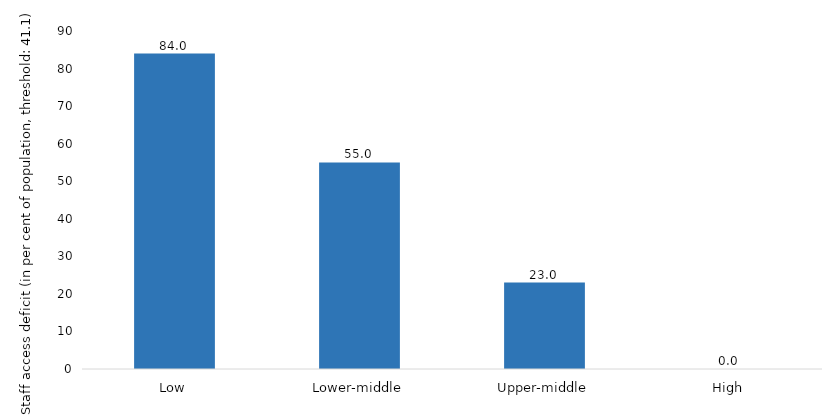
| Category | Series 0 |
|---|---|
| Low | 84 |
| Lower-middle | 55 |
| Upper-middle | 23 |
| High | 0 |